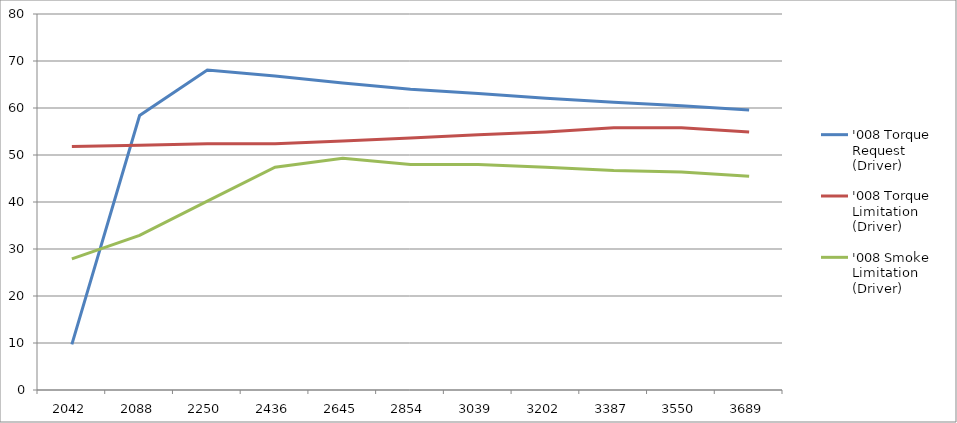
| Category | '008 Torque Request (Driver) | '008 Torque Limitation (Driver) | '008 Smoke Limitation (Driver) |
|---|---|---|---|
| 2042.0 | 9.7 | 51.8 | 27.9 |
| 2088.0 | 58.4 | 52.1 | 32.9 |
| 2250.0 | 68.1 | 52.4 | 40.2 |
| 2436.0 | 66.8 | 52.4 | 47.4 |
| 2645.0 | 65.3 | 53 | 49.3 |
| 2854.0 | 64 | 53.6 | 48 |
| 3039.0 | 63.1 | 54.3 | 48 |
| 3202.0 | 62.1 | 54.9 | 47.4 |
| 3387.0 | 61.2 | 55.8 | 46.7 |
| 3550.0 | 60.5 | 55.8 | 46.4 |
| 3689.0 | 59.6 | 54.9 | 45.5 |